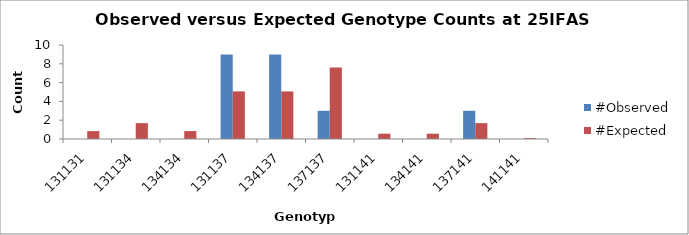
| Category | #Observed | #Expected |
|---|---|---|
| 131131.0 | 0 | 0.844 |
| 131134.0 | 0 | 1.688 |
| 134134.0 | 0 | 0.844 |
| 131137.0 | 9 | 5.062 |
| 134137.0 | 9 | 5.062 |
| 137137.0 | 3 | 7.594 |
| 131141.0 | 0 | 0.562 |
| 134141.0 | 0 | 0.562 |
| 137141.0 | 3 | 1.688 |
| 141141.0 | 0 | 0.094 |